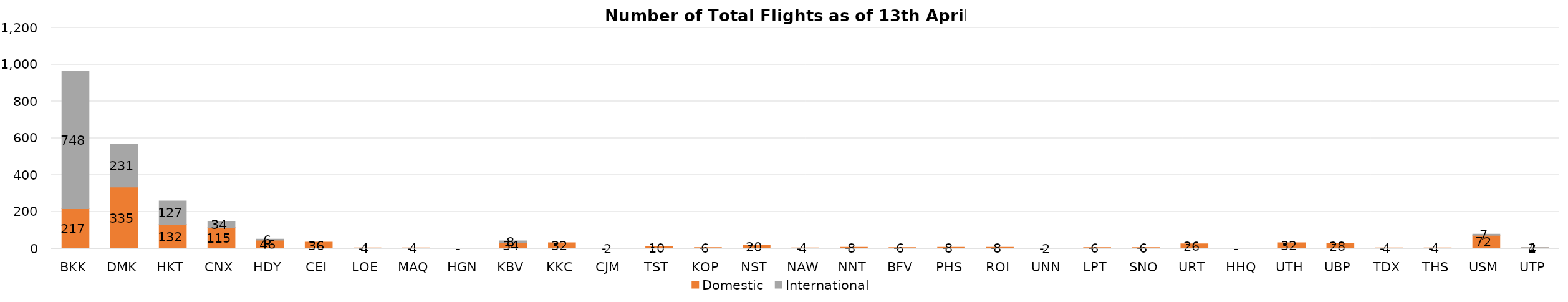
| Category | Domestic | International |
|---|---|---|
| BKK | 217 | 748 |
| DMK | 335 | 231 |
| HKT | 132 | 127 |
| CNX | 115 | 34 |
| HDY | 46 | 6 |
| CEI | 36 | 0 |
| LOE | 4 | 0 |
| MAQ | 4 | 0 |
| HGN | 0 | 0 |
| KBV | 34 | 8 |
| KKC | 32 | 0 |
| CJM | 2 | 0 |
| TST | 10 | 0 |
| KOP | 6 | 0 |
| NST | 20 | 0 |
| NAW | 4 | 0 |
| NNT | 8 | 0 |
| BFV | 6 | 0 |
| PHS | 8 | 0 |
| ROI | 8 | 0 |
| UNN | 2 | 0 |
| LPT | 6 | 0 |
| SNO | 6 | 0 |
| URT | 26 | 0 |
| HHQ | 0 | 0 |
| UTH | 32 | 0 |
| UBP | 28 | 0 |
| TDX | 4 | 0 |
| THS | 4 | 0 |
| USM | 72 | 7 |
| UTP | 4 | 2 |